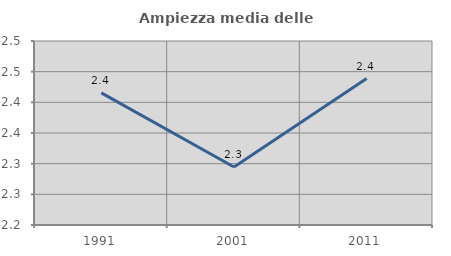
| Category | Ampiezza media delle famiglie |
|---|---|
| 1991.0 | 2.415 |
| 2001.0 | 2.295 |
| 2011.0 | 2.439 |